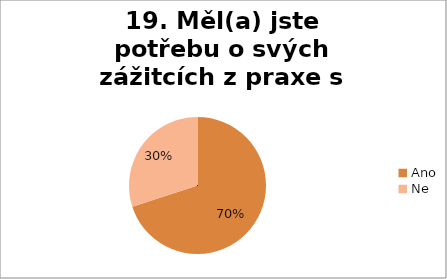
| Category | 19. Měl(a) jste potřebu o svých zážitcích z praxe s někým mluvit?  |
|---|---|
| Ano | 0.7 |
| Ne | 0.3 |